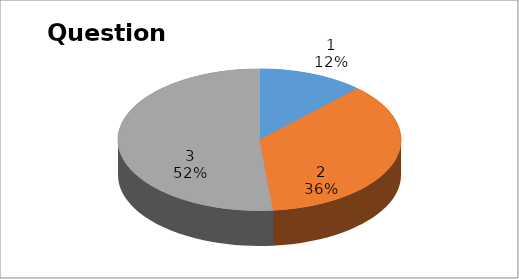
| Category | Series 0 |
|---|---|
| 0 | 4 |
| 1 | 12 |
| 2 | 17 |